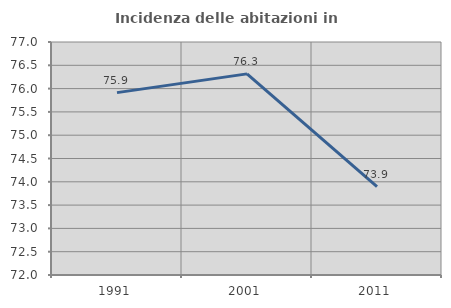
| Category | Incidenza delle abitazioni in proprietà  |
|---|---|
| 1991.0 | 75.913 |
| 2001.0 | 76.316 |
| 2011.0 | 73.895 |